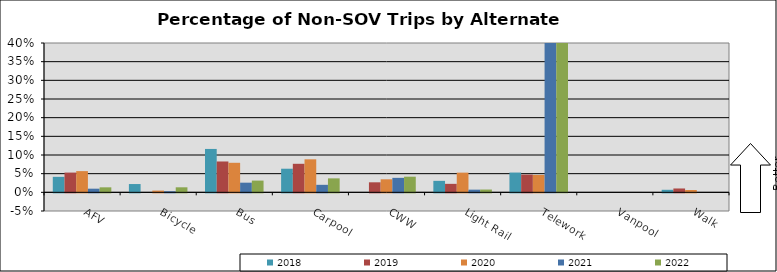
| Category | 2018 | 2019 | 2020 | 2021 | 2022 |
|---|---|---|---|---|---|
| AFV | 0.042 | 0.053 | 0.057 | 0.01 | 0.013 |
| Bicycle | 0.022 | 0 | 0.005 | 0.003 | 0.013 |
| Bus | 0.116 | 0.083 | 0.079 | 0.026 | 0.031 |
| Carpool | 0.063 | 0.076 | 0.088 | 0.02 | 0.037 |
| CWW | 0 | 0.027 | 0.035 | 0.039 | 0.042 |
| Light Rail | 0.031 | 0.023 | 0.053 | 0.007 | 0.007 |
| Telework | 0.053 | 0.048 | 0.047 | 0.642 | 0.485 |
| Vanpool | 0 | 0 | 0 | 0 | 0 |
| Walk | 0.007 | 0.01 | 0.006 | 0 | 0 |